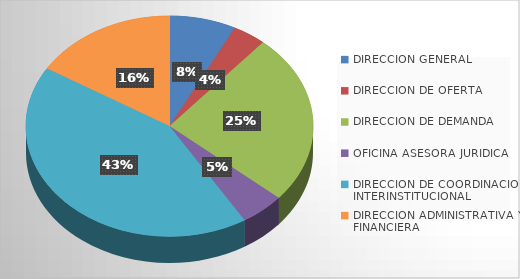
| Category | Series 0 |
|---|---|
| DIRECCION GENERAL | 6 |
| DIRECCION DE OFERTA | 3 |
| DIRECCION DE DEMANDA | 20 |
| OFICINA ASESORA JURIDICA | 4 |
| DIRECCION DE COORDINACION INTERINSTITUCIONAL | 34 |
| DIRECCION ADMINISTRATIVA Y FINANCIERA | 13 |